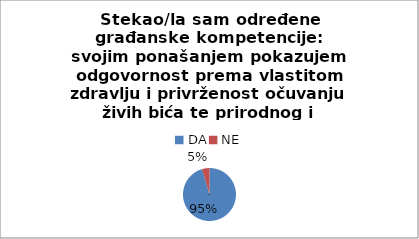
| Category | Series 0 |
|---|---|
| DA | 21 |
| NE | 1 |